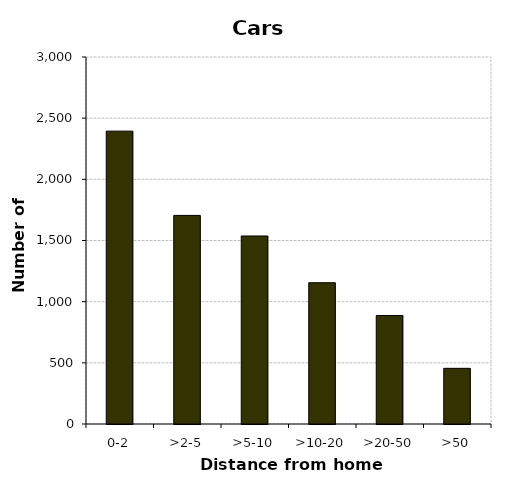
| Category | Cars |
|---|---|
| 0-2 | 2394 |
| >2-5 | 1705 |
| >5-10 | 1537 |
| >10-20 | 1155 |
| >20-50 | 887 |
| >50 | 455 |